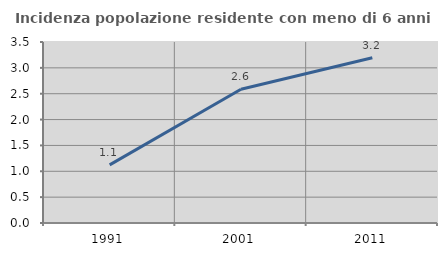
| Category | Incidenza popolazione residente con meno di 6 anni |
|---|---|
| 1991.0 | 1.124 |
| 2001.0 | 2.586 |
| 2011.0 | 3.196 |